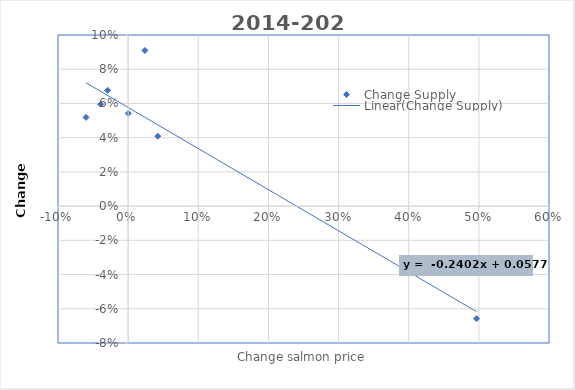
| Category | Change Supply |
|---|---|
| 0.023810519550268933 | 0.091 |
| 0.04233327636044244 | 0.041 |
| 0.4966589688580373 | -0.066 |
| -0.03925059574351516 | 0.06 |
| 9.503174060114837e-05 | 0.054 |
| -0.029216316032865137 | 0.068 |
| -0.05998398174830414 | 0.052 |